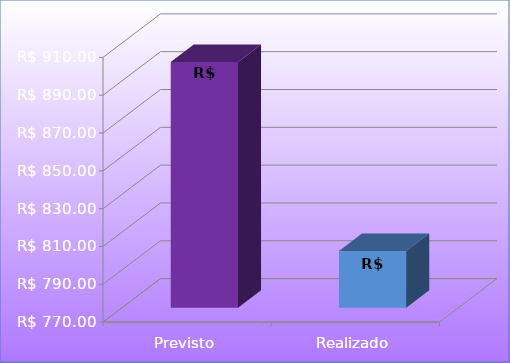
| Category | Series 0 |
|---|---|
| Previsto | 900 |
| Realizado | 800 |